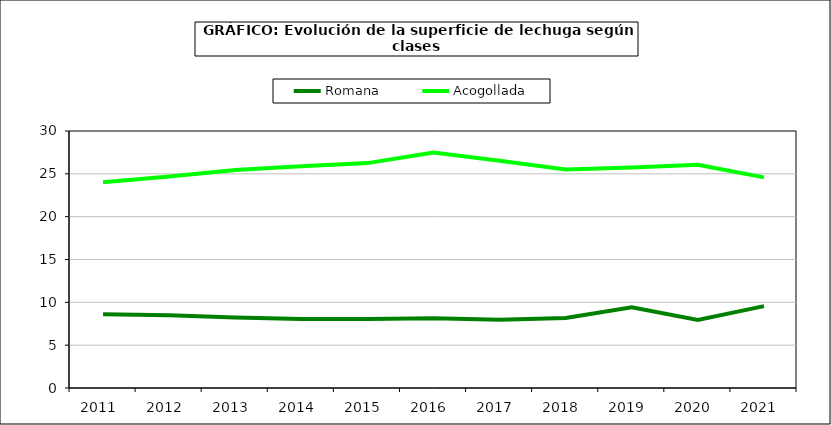
| Category | Romana | Acogollada |
|---|---|---|
| 2011.0 | 8.605 | 24.015 |
| 2012.0 | 8.497 | 24.699 |
| 2013.0 | 8.23 | 25.438 |
| 2014.0 | 8.041 | 25.883 |
| 2015.0 | 8.063 | 26.251 |
| 2016.0 | 8.145 | 27.501 |
| 2017.0 | 7.972 | 26.536 |
| 2018.0 | 8.166 | 25.508 |
| 2019.0 | 9.434 | 25.734 |
| 2020.0 | 7.956 | 26.049 |
| 2021.0 | 9.56 | 24.59 |